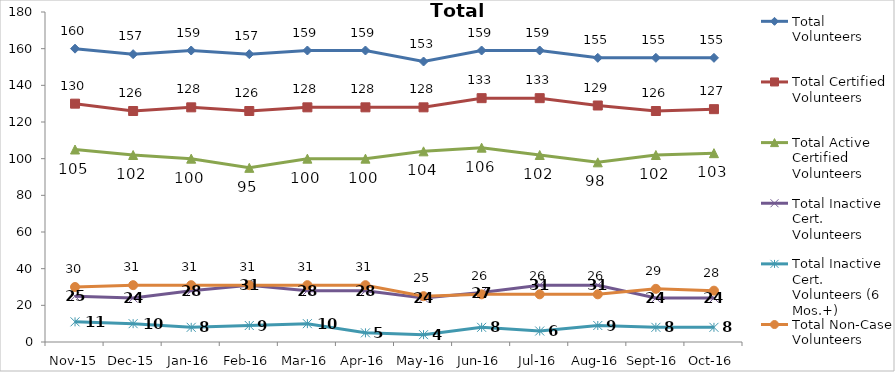
| Category | Total Volunteers | Total Certified Volunteers | Total Active Certified Volunteers | Total Inactive Cert. Volunteers | Total Inactive Cert. Volunteers (6 Mos.+) | Total Non-Case Volunteers |
|---|---|---|---|---|---|---|
| Nov-15 | 160 | 130 | 105 | 25 | 11 | 30 |
| Dec-15 | 157 | 126 | 102 | 24 | 10 | 31 |
| Jan-16 | 159 | 128 | 100 | 28 | 8 | 31 |
| Feb-16 | 157 | 126 | 95 | 31 | 9 | 31 |
| Mar-16 | 159 | 128 | 100 | 28 | 10 | 31 |
| Apr-16 | 159 | 128 | 100 | 28 | 5 | 31 |
| May-16 | 153 | 128 | 104 | 24 | 4 | 25 |
| Jun-16 | 159 | 133 | 106 | 27 | 8 | 26 |
| Jul-16 | 159 | 133 | 102 | 31 | 6 | 26 |
| Aug-16 | 155 | 129 | 98 | 31 | 9 | 26 |
| Sep-16 | 155 | 126 | 102 | 24 | 8 | 29 |
| Oct-16 | 155 | 127 | 103 | 24 | 8 | 28 |